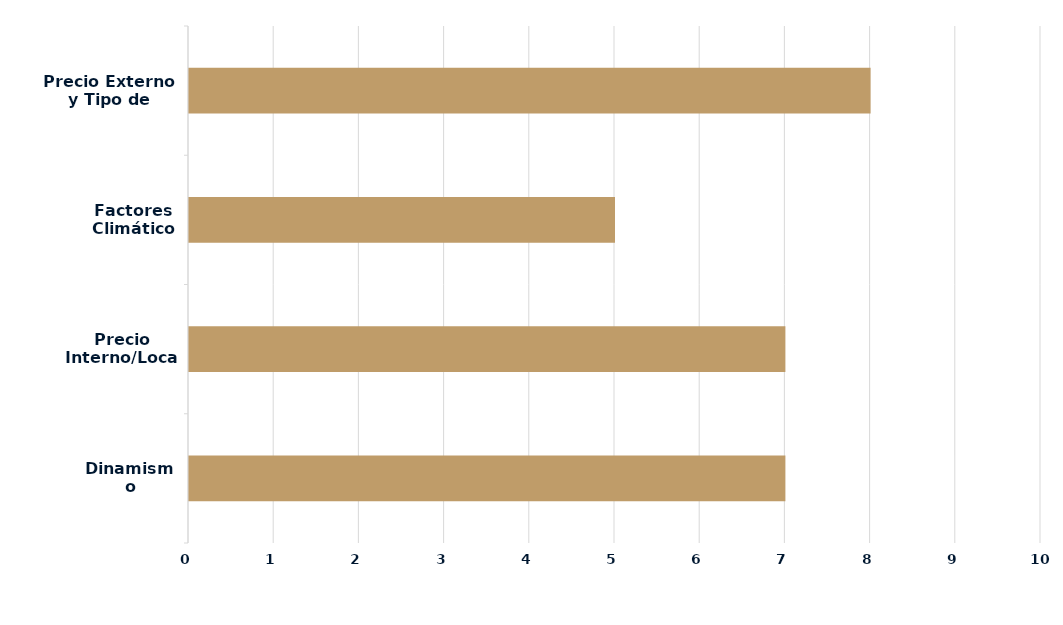
| Category | Series 0 |
|---|---|
| Dinamismo Demanda | 7 |
| Precio Interno/Local | 7 |
| Factores Climáticos | 5 |
| Precio Externo y Tipo de Cambio | 8 |